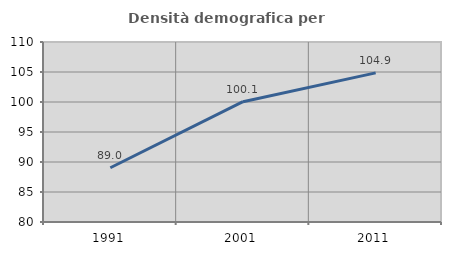
| Category | Densità demografica |
|---|---|
| 1991.0 | 89.041 |
| 2001.0 | 100.054 |
| 2011.0 | 104.854 |